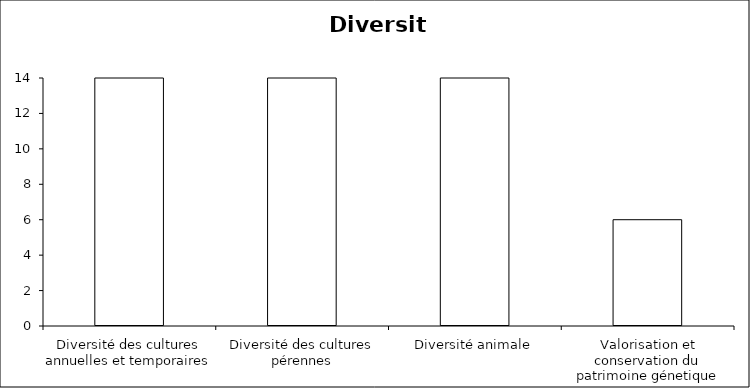
| Category | Series 0 | Series 1 |
|---|---|---|
| Diversité des cultures annuelles et temporaires | 0 | 14 |
| Diversité des cultures pérennes | 0 | 14 |
| Diversité animale | 0 | 14 |
| Valorisation et conservation du patrimoine génetique | 0 | 6 |